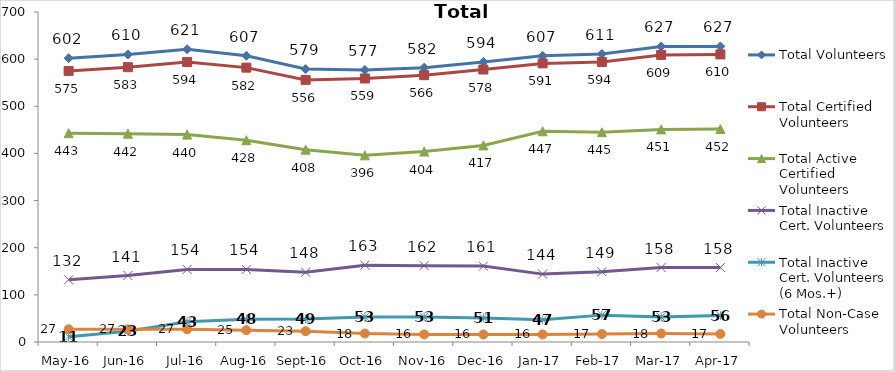
| Category | Total Volunteers | Total Certified Volunteers | Total Active Certified Volunteers | Total Inactive Cert. Volunteers | Total Inactive Cert. Volunteers (6 Mos.+) | Total Non-Case Volunteers |
|---|---|---|---|---|---|---|
| May-16 | 602 | 575 | 443 | 132 | 11 | 27 |
| Jun-16 | 610 | 583 | 442 | 141 | 23 | 27 |
| Jul-16 | 621 | 594 | 440 | 154 | 43 | 27 |
| Aug-16 | 607 | 582 | 428 | 154 | 48 | 25 |
| Sep-16 | 579 | 556 | 408 | 148 | 49 | 23 |
| Oct-16 | 577 | 559 | 396 | 163 | 53 | 18 |
| Nov-16 | 582 | 566 | 404 | 162 | 53 | 16 |
| Dec-16 | 594 | 578 | 417 | 161 | 51 | 16 |
| Jan-17 | 607 | 591 | 447 | 144 | 47 | 16 |
| Feb-17 | 611 | 594 | 445 | 149 | 57 | 17 |
| Mar-17 | 627 | 609 | 451 | 158 | 53 | 18 |
| Apr-17 | 627 | 610 | 452 | 158 | 56 | 17 |